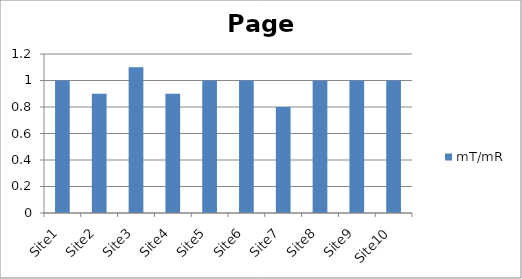
| Category | mT/mR |
|---|---|
| Site1 | 1 |
| Site2 | 0.9 |
| Site3 | 1.1 |
| Site4 | 0.9 |
| Site5 | 1 |
| Site6 | 1 |
| Site7 | 0.8 |
| Site8 | 1 |
| Site9 | 1 |
| Site10 | 1 |